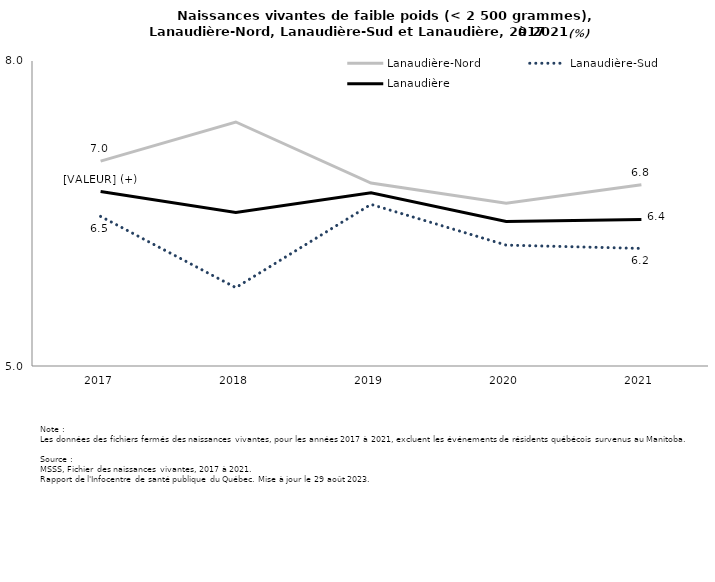
| Category | Lanaudière-Nord | Lanaudière-Sud | Lanaudière |
|---|---|---|---|
| 2017.0 | 7.015 | 6.472 | 6.716 |
| 2018.0 | 7.4 | 5.771 | 6.511 |
| 2019.0 | 6.8 | 6.59 | 6.704 |
| 2020.0 | 6.6 | 6.189 | 6.421 |
| 2021.0 | 6.782 | 6.156 | 6.44 |